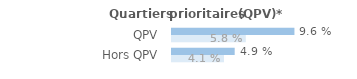
| Category | Series 0 | Series 1 |
|---|---|---|
| QPV | 0.096 | 0.058 |
| Hors QPV | 0.049 | 0.041 |